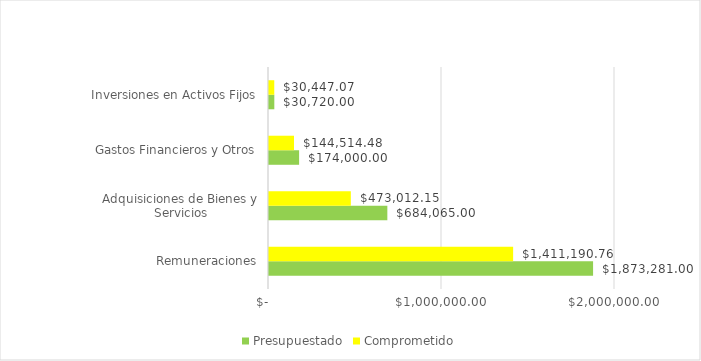
| Category | Presupuestado | Comprometido |
|---|---|---|
| Remuneraciones | 1873281 | 1411190.76 |
| Adquisiciones de Bienes y Servicios | 684065 | 473012.15 |
| Gastos Financieros y Otros | 174000 | 144514.48 |
| Inversiones en Activos Fijos | 30720 | 30447.07 |